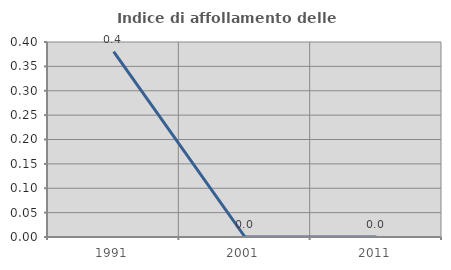
| Category | Indice di affollamento delle abitazioni  |
|---|---|
| 1991.0 | 0.38 |
| 2001.0 | 0 |
| 2011.0 | 0 |